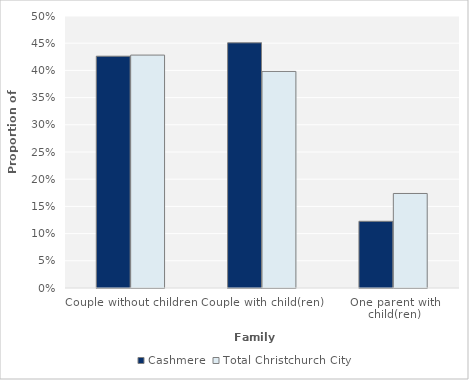
| Category | Cashmere | Total Christchurch City |
|---|---|---|
| Couple without children | 0.426 | 0.428 |
| Couple with child(ren) | 0.451 | 0.398 |
| One parent with child(ren) | 0.123 | 0.174 |